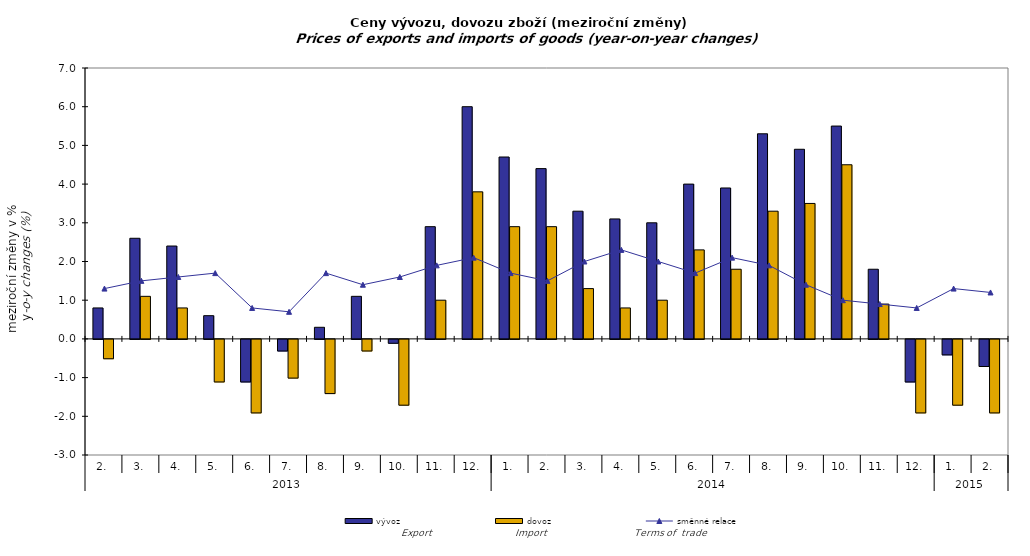
| Category | vývoz | dovoz |
|---|---|---|
| 0 | 0.8 | -0.5 |
| 1 | 2.6 | 1.1 |
| 2 | 2.4 | 0.8 |
| 3 | 0.6 | -1.1 |
| 4 | -1.1 | -1.9 |
| 5 | -0.3 | -1 |
| 6 | 0.3 | -1.4 |
| 7 | 1.1 | -0.3 |
| 8 | -0.1 | -1.7 |
| 9 | 2.9 | 1 |
| 10 | 6 | 3.8 |
| 11 | 4.7 | 2.9 |
| 12 | 4.4 | 2.9 |
| 13 | 3.3 | 1.3 |
| 14 | 3.1 | 0.8 |
| 15 | 3 | 1 |
| 16 | 4 | 2.3 |
| 17 | 3.9 | 1.8 |
| 18 | 5.3 | 3.3 |
| 19 | 4.9 | 3.5 |
| 20 | 5.5 | 4.5 |
| 21 | 1.8 | 0.9 |
| 22 | -1.1 | -1.9 |
| 23 | -0.4 | -1.7 |
| 24 | -0.7 | -1.9 |